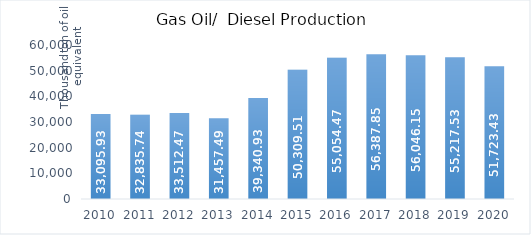
| Category | Gas Oil/Diesel Production* |
|---|---|
| 2010.0 | 33095.93 |
| 2011.0 | 32835.74 |
| 2012.0 | 33512.47 |
| 2013.0 | 31457.49 |
| 2014.0 | 39340.93 |
| 2015.0 | 50309.51 |
| 2016.0 | 55054.47 |
| 2017.0 | 56387.85 |
| 2018.0 | 56046.15 |
| 2019.0 | 55217.53 |
| 2020.0 | 51723.43 |